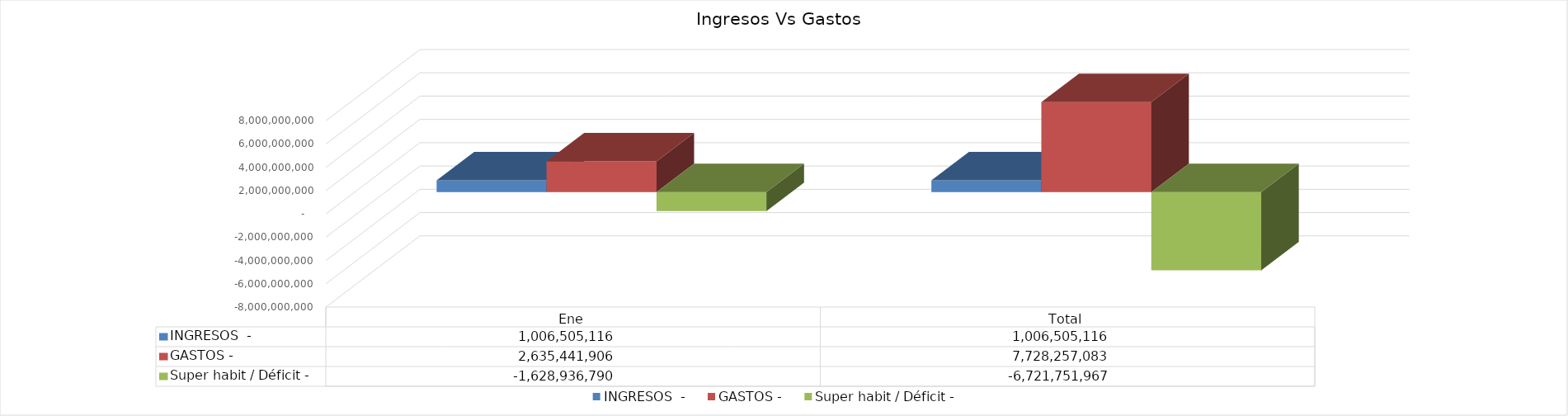
| Category | INGRESOS  | GASTOS | Super habit / Déficit |
|---|---|---|---|
| Ene | 1006505116 | 2635441906 | -1628936790 |
| Total | 1006505116 | 7728257082.55 | -6721751966.55 |